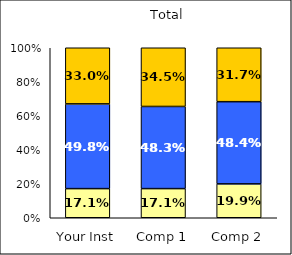
| Category | Low Student-Centered Pedagogy | Average Student-Centered Pedagogy | High Student-Centered Pedagogy |
|---|---|---|---|
| Your Inst | 0.171 | 0.498 | 0.33 |
| Comp 1 | 0.171 | 0.483 | 0.345 |
| Comp 2 | 0.199 | 0.484 | 0.317 |